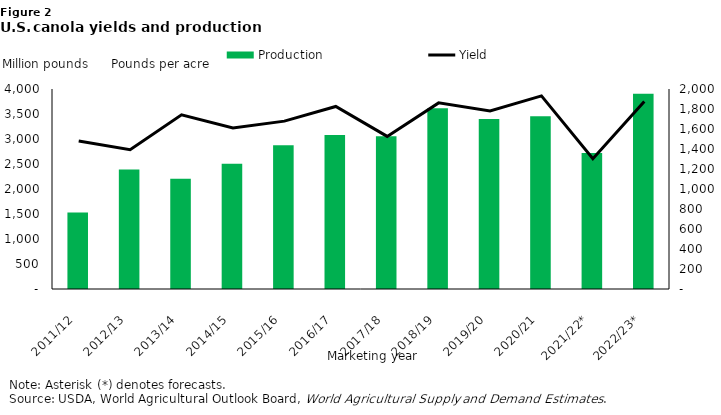
| Category | Production |
|---|---|
|  2011/12  | 1528.01 |
|  2012/13  | 2391.61 |
|  2013/14  | 2203.055 |
|  2014/15  | 2506.595 |
|  2015/16  | 2876.57 |
|  2016/17  | 3078.99 |
|  2017/18  | 3055.41 |
|  2018/19  | 3615.44 |
|  2019/20  | 3400.865 |
|  2020/21  | 3453.062 |
|  2021/22*  | 2720.55 |
|  2022/23*  | 3905 |